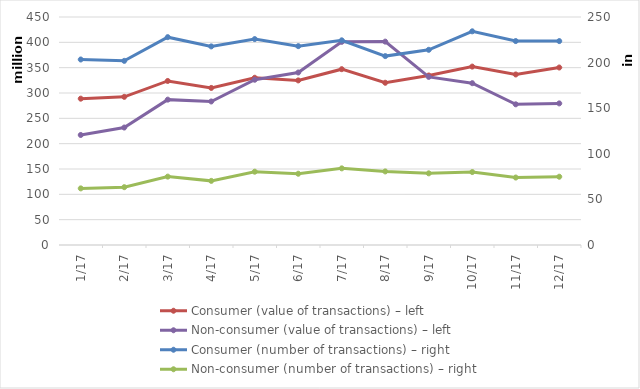
| Category | Consumer (value of transactions) – left | Non-consumer (value of transactions) – left |
|---|---|---|
| 2017-01-01 | 288826372 | 217145105 |
| 2017-02-01 | 292442764 | 231855259 |
| 2017-03-01 | 323762322 | 286910577 |
| 2017-04-01 | 310001829 | 283281935 |
| 2017-05-01 | 330070806 | 326174897 |
| 2017-06-01 | 324843310 | 340442900 |
| 2017-07-01 | 347013497 | 400973211 |
| 2017-08-01 | 320219300 | 401392954 |
| 2017-09-01 | 334567679 | 331775969 |
| 2017-10-01 | 352122450 | 319355773 |
| 2017-11-01 | 336570904 | 277676557 |
| 2017-12-01 | 350324111 | 279471580 |